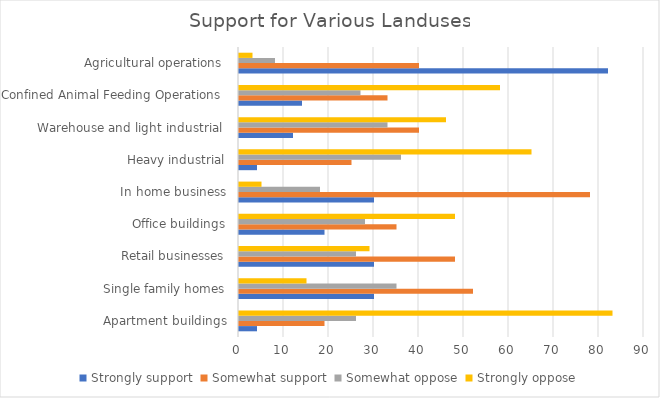
| Category | Strongly support | Somewhat support | Somewhat oppose | Strongly oppose |
|---|---|---|---|---|
| Apartment buildings | 4 | 19 | 26 | 83 |
| Single family homes | 30 | 52 | 35 | 15 |
| Retail businesses | 30 | 48 | 26 | 29 |
| Office buildings | 19 | 35 | 28 | 48 |
| In home business | 30 | 78 | 18 | 5 |
| Heavy industrial | 4 | 25 | 36 | 65 |
| Warehouse and light industrial  | 12 | 40 | 33 | 46 |
| Confined Animal Feeding Operations  | 14 | 33 | 27 | 58 |
| Agricultural operations  | 82 | 40 | 8 | 3 |